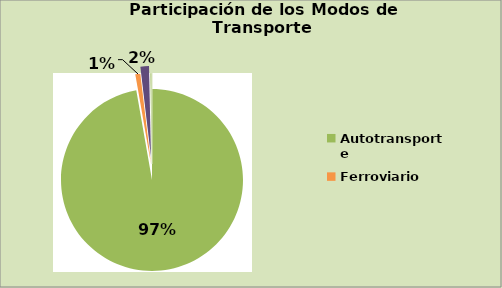
| Category | Series 0 |
|---|---|
| Autotransporte | 97.236 |
| Ferroviario | 0.895 |
| Aéreo | 1.518 |
| Puertos y Marina Mercante | 0.35 |